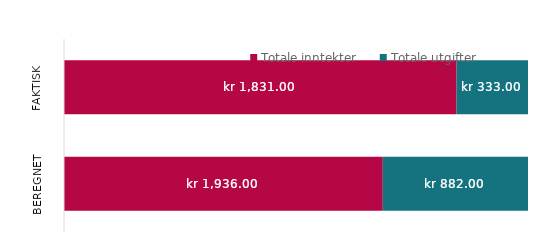
| Category | Totale inntekter | Totale utgifter |
|---|---|---|
| Beregnet | 1936 | 882 |
| Faktisk | 1831 | 333 |